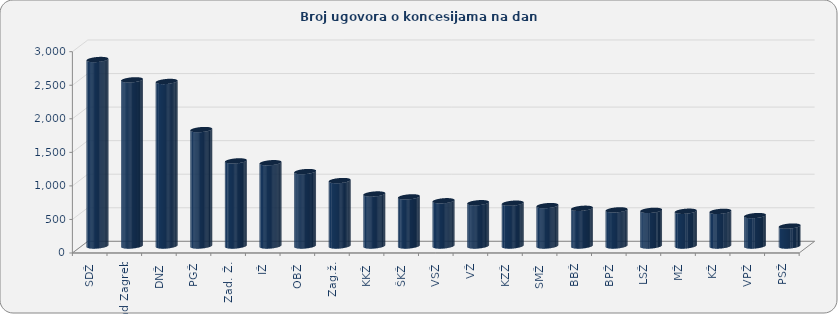
| Category | UKUPNO |
|---|---|
| SDŽ | 2779 |
| Grad Zagreb | 2476 |
| DNŽ | 2452 |
| PGŽ | 1735 |
| Zad. Ž. | 1268 |
| IŽ | 1241 |
| OBŽ | 1109 |
| Zag.ž. | 975 |
| KKŽ | 775 |
| ŠKŽ | 732 |
| VSŽ | 674 |
| VŽ | 645 |
| KZŽ | 638 |
| SMŽ | 602 |
| BBŽ | 562 |
| BPŽ | 538 |
| LSŽ | 531 |
| MŽ | 518 |
| KŽ | 516 |
| VPŽ | 453 |
| PSŽ | 297 |